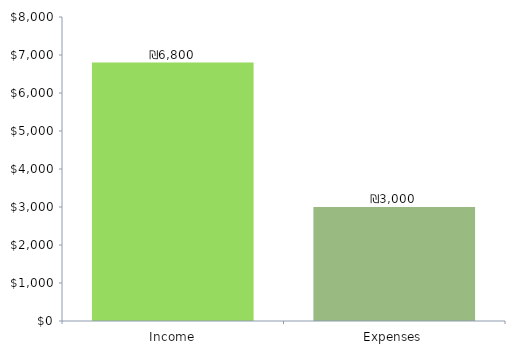
| Category | ChartData |
|---|---|
| 0 | 6800 |
| 1 | 3000 |